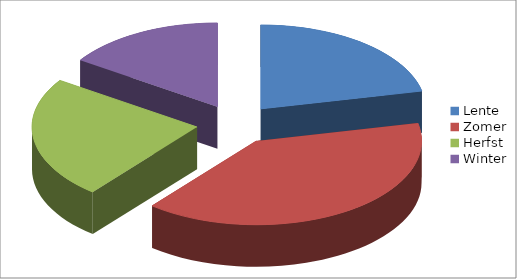
| Category | Series 0 |
|---|---|
| Lente | 0.216 |
| Zomer | 0.393 |
| Herfst | 0.235 |
| Winter | 0.156 |